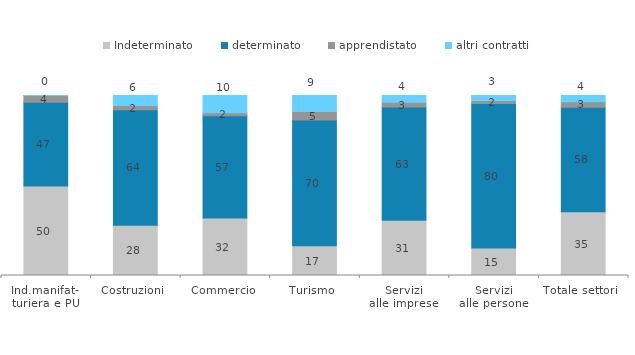
| Category | Indeterminato | determinato | apprendistato | altri contratti |
|---|---|---|---|---|
| Ind.manifat-
turiera e PU | 49.67 | 46.568 | 3.711 | 0.051 |
| Costruzioni | 27.889 | 64.253 | 2.311 | 5.547 |
| Commercio | 32.013 | 56.766 | 1.65 | 9.571 |
| Turismo | 16.524 | 69.801 | 4.843 | 8.832 |
| Servizi
alle imprese | 30.71 | 62.949 | 2.597 | 3.743 |
| Servizi
alle persone | 15.294 | 80.235 | 1.647 | 2.824 |
| Totale settori | 35.368 | 58.168 | 2.94 | 3.524 |